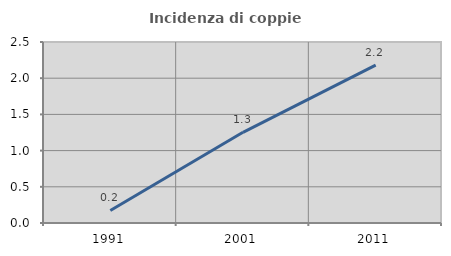
| Category | Incidenza di coppie miste |
|---|---|
| 1991.0 | 0.174 |
| 2001.0 | 1.253 |
| 2011.0 | 2.181 |